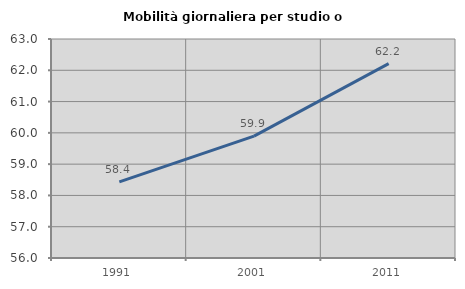
| Category | Mobilità giornaliera per studio o lavoro |
|---|---|
| 1991.0 | 58.435 |
| 2001.0 | 59.896 |
| 2011.0 | 62.215 |